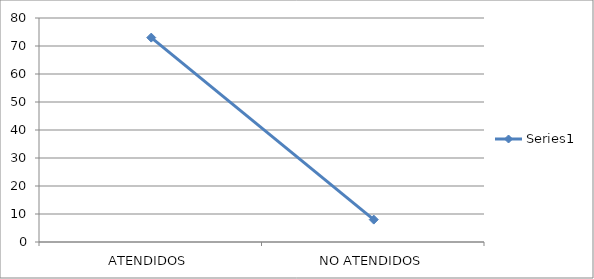
| Category | Series 0 |
|---|---|
| ATENDIDOS | 73 |
| NO ATENDIDOS | 8 |